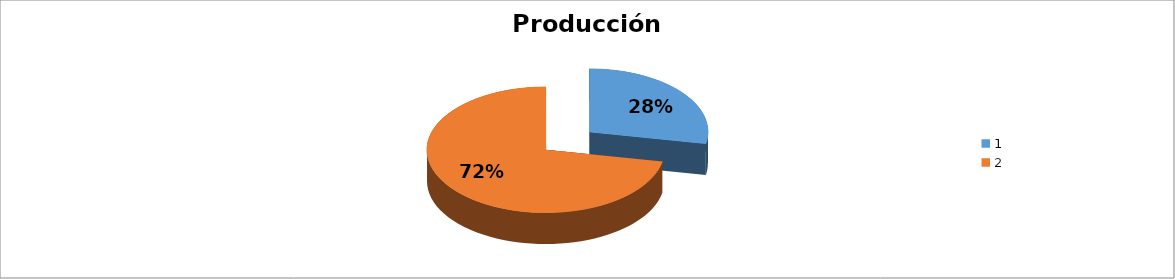
| Category | Series 0 |
|---|---|
| 0 | 0.28 |
| 1 | 0.72 |